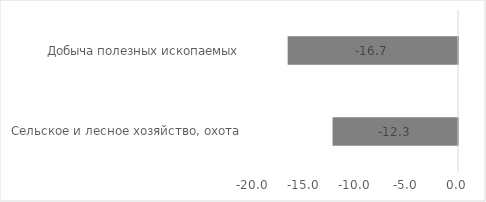
| Category | Series 0 |
|---|---|
| Сельское и лесное хозяйство, охота | -12.3 |
| Добыча полезных ископаемых | -16.7 |